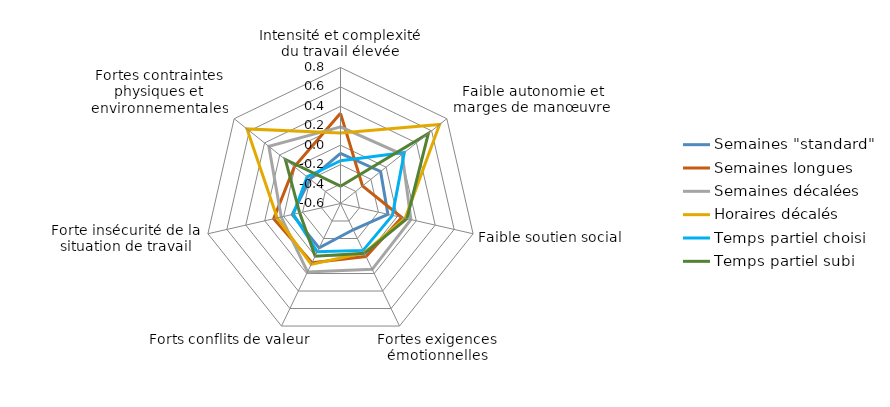
| Category | Semaines "standard" | Semaines longues | Semaines décalées | Horaires décalés | Temps partiel choisi | Temps partiel subi |
|---|---|---|---|---|---|---|
| Intensité et complexité du travail élevée | -0.084 | 0.328 | 0.189 | 0.125 | -0.16 | -0.422 |
| Faible autonomie et marges de manœuvre | -0.072 | -0.31 | 0.212 | 0.704 | 0.24 | 0.557 |
| Faible soutien social | -0.099 | 0.047 | 0.143 | 0.083 | -0.052 | 0.102 |
| Fortes exigences émotionnelles | -0.3 | 0.006 | 0.152 | -0.037 | -0.064 | -0.03 |
| Forts conflits de valeur | -0.093 | 0.076 | 0.182 | 0.096 | -0.048 | 0.001 |
| Forte insécurité de la situation de travail | -0.09 | 0.106 | 0.026 | 0.068 | -0.102 | -0.169 |
| Fortes contraintes physiques et environnementales | -0.198 | 0.008 | 0.343 | 0.631 | -0.16 | 0.126 |